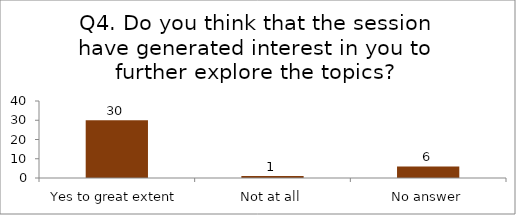
| Category | Q4. Do you think that the session have generated interest in you to further explore the topics? |
|---|---|
| Yes to great extent | 30 |
| Not at all | 1 |
| No answer | 6 |